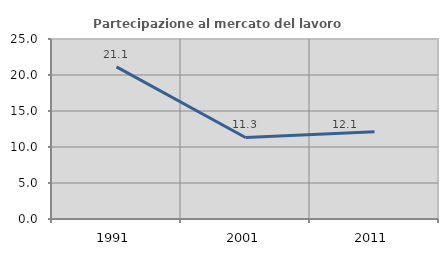
| Category | Partecipazione al mercato del lavoro  femminile |
|---|---|
| 1991.0 | 21.127 |
| 2001.0 | 11.321 |
| 2011.0 | 12.121 |